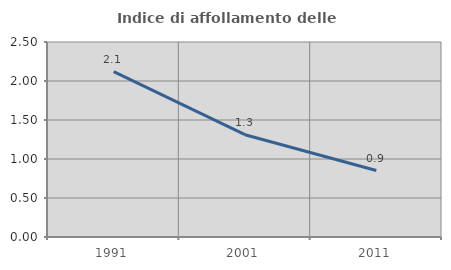
| Category | Indice di affollamento delle abitazioni  |
|---|---|
| 1991.0 | 2.12 |
| 2001.0 | 1.311 |
| 2011.0 | 0.852 |